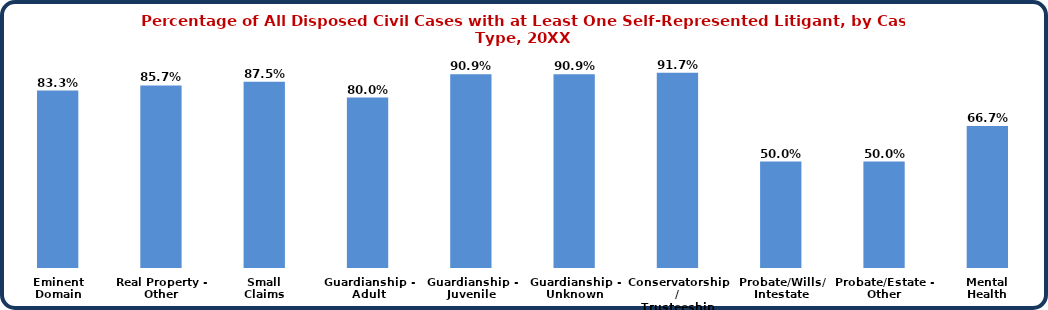
| Category | Series 0 |
|---|---|
| Eminent
Domain | 0.833 |
| Real Property -
Other | 0.857 |
| Small
Claims | 0.875 |
| Guardianship -
Adult | 0.8 |
| Guardianship -
Juvenile | 0.909 |
| Guardianship -
Unknown | 0.909 |
| Conservatorship/
Trusteeship | 0.917 |
| Probate/Wills/
Intestate | 0.5 |
| Probate/Estate -
Other | 0.5 |
| Mental
Health | 0.667 |